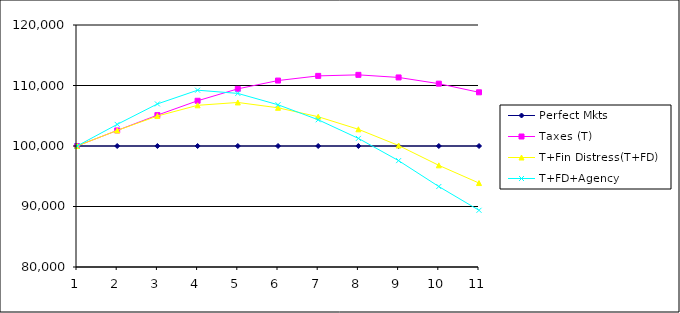
| Category | Perfect Mkts | Taxes (T) | T+Fin Distress(T+FD) | T+FD+Agency |
|---|---|---|---|---|
| 0 | 100000 | 100000 | 100000 | 100000 |
| 1 | 100000 | 102571.429 | 102571.429 | 103571.429 |
| 2 | 100000 | 105102.857 | 104952.857 | 106952.857 |
| 3 | 100000 | 107474.286 | 106724.286 | 109224.286 |
| 4 | 100000 | 109445.714 | 107195.714 | 108695.714 |
| 5 | 100000 | 110817.143 | 106317.143 | 106817.143 |
| 6 | 100000 | 111588.571 | 104838.571 | 104338.571 |
| 7 | 100000 | 111760 | 102760 | 101260 |
| 8 | 100000 | 111331.429 | 100081.429 | 97581.429 |
| 9 | 100000 | 110302.857 | 96802.857 | 93302.857 |
| 10 | 100000 | 108874.286 | 93874.286 | 89374.286 |